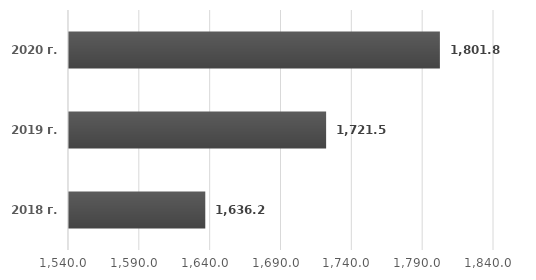
| Category | Series 0 |
|---|---|
| 2018 г. | 1636.2 |
| 2019 г. | 1721.5 |
| 2020 г. | 1801.8 |